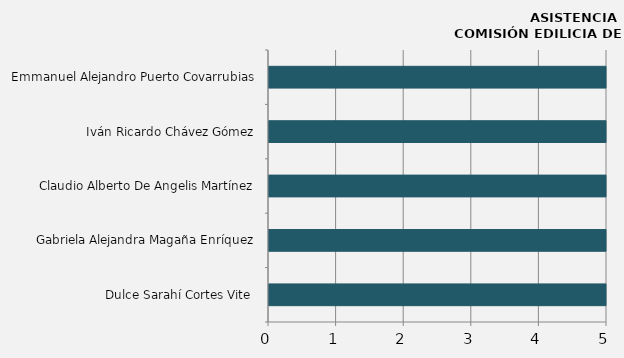
| Category | Series 0 |
|---|---|
| Dulce Sarahí Cortes Vite  | 13 |
| Gabriela Alejandra Magaña Enríquez | 10 |
| Claudio Alberto De Angelis Martínez | 9 |
| Iván Ricardo Chávez Gómez | 10 |
| Emmanuel Alejandro Puerto Covarrubias | 11 |